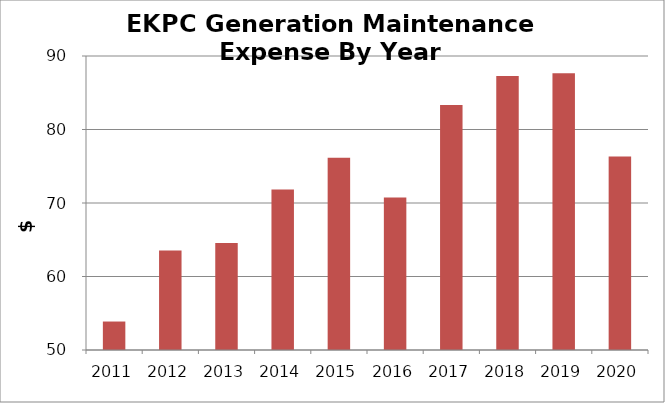
| Category | Series 1 |
|---|---|
| 2011.0 | 53.874 |
| 2012.0 | 63.554 |
| 2013.0 | 64.573 |
| 2014.0 | 71.84 |
| 2015.0 | 76.143 |
| 2016.0 | 70.744 |
| 2017.0 | 83.337 |
| 2018.0 | 87.277 |
| 2019.0 | 87.647 |
| 2020.0 | 76.334 |